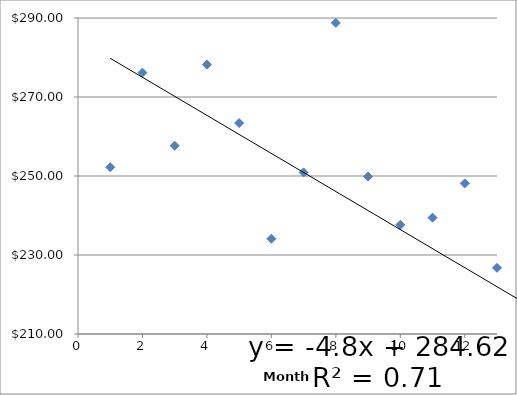
| Category | Series 0 |
|---|---|
| 1.0 | 252.22 |
| 2.0 | 276.16 |
| 3.0 | 257.67 |
| 4.0 | 278.21 |
| 5.0 | 263.4 |
| 6.0 | 234.12 |
| 7.0 | 250.91 |
| 8.0 | 288.76 |
| 9.0 | 249.87 |
| 10.0 | 237.65 |
| 11.0 | 239.45 |
| 12.0 | 248.12 |
| 13.0 | 226.75 |
| 14.0 | 217.083 |
| 15.0 | 208.126 |
| 16.0 | 199.169 |
| 17.0 | 190.212 |
| 18.0 | 181.255 |